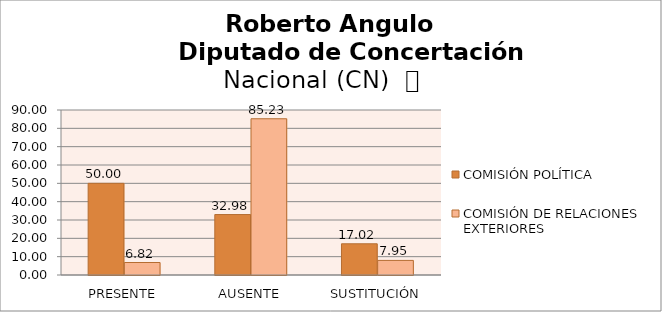
| Category | COMISIÓN POLÍTICA | COMISIÓN DE RELACIONES EXTERIORES |
|---|---|---|
| PRESENTE | 50 | 6.818 |
| AUSENTE | 32.979 | 85.227 |
| SUSTITUCIÓN | 17.021 | 7.955 |